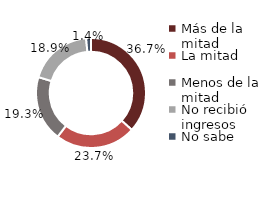
| Category | Series 0 |
|---|---|
| Más de la mitad | 36953.266 |
| La mitad | 23850.698 |
| Menos de la mitad | 19433.951 |
| No recibió ingresos | 19050.352 |
| No sabe | 1418.111 |